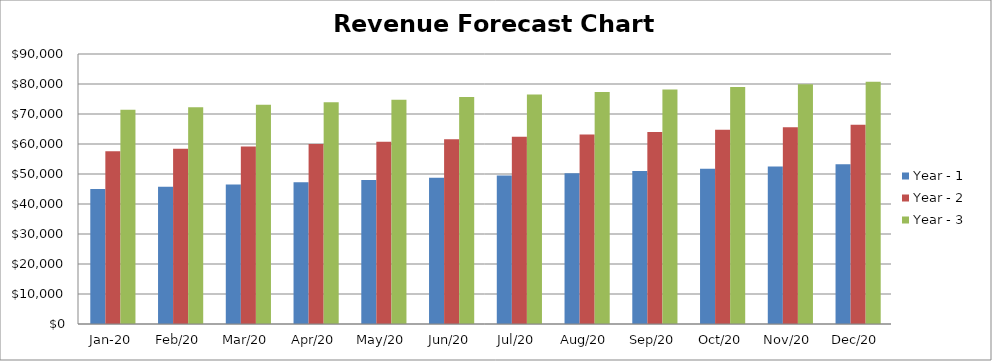
| Category | Year - 1 | Year - 2 | Year - 3 |
|---|---|---|---|
| 2020-01-01 | 44985 | 57582 | 71379 |
| 2020-02-01 | 45734.75 | 58381.75 | 72228.75 |
| 2020-03-01 | 46484.5 | 59181.5 | 73078.5 |
| 2020-04-01 | 47234.25 | 59981.25 | 73928.25 |
| 2020-05-01 | 47984 | 60781 | 74778 |
| 2020-06-01 | 48733.75 | 61580.75 | 75627.75 |
| 2020-07-01 | 49483.5 | 62380.5 | 76477.5 |
| 2020-08-01 | 50233.25 | 63180.25 | 77327.25 |
| 2020-09-01 | 50983 | 63980 | 78177 |
| 2020-10-01 | 51732.75 | 64779.75 | 79026.75 |
| 2020-11-01 | 52482.5 | 65579.5 | 79876.5 |
| 2020-12-01 | 53232.25 | 66379.25 | 80726.25 |